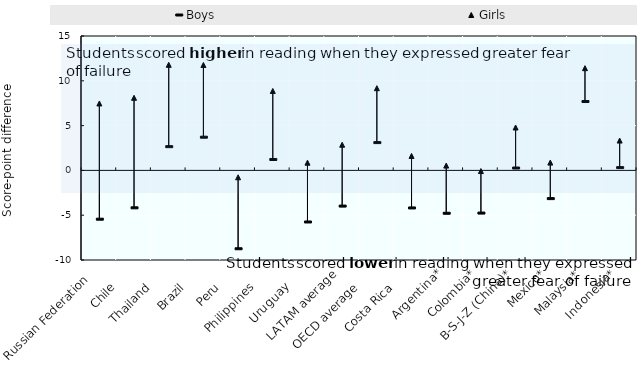
| Category | Boys | Girls |
|---|---|---|
| Russian Federation   | -5.446 | 7.47 |
| Chile      | -4.177 | 8.102 |
| Thailand      | 2.65 | 11.784 |
| Brazil      | 3.705 | 11.765 |
| Peru      | -8.745 | -0.77 |
| Philippines      | 1.217 | 8.866 |
| Uruguay      | -5.756 | 0.86 |
| LATAM average | -3.982 | 2.864 |
| OECD average      | 3.103 | 9.175 |
| Costa Rica      | -4.191 | 1.614 |
| Argentina* | -4.784 | 0.539 |
| Colombia* | -4.763 | -0.074 |
| B-S-J-Z (China)* | 0.266 | 4.789 |
| Mexico* | -3.15 | 0.875 |
| Malaysia* | 7.687 | 11.41 |
| Indonesia* | 0.31 | 3.332 |